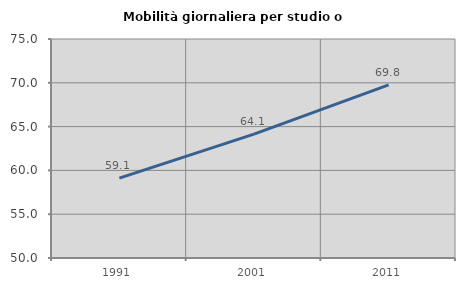
| Category | Mobilità giornaliera per studio o lavoro |
|---|---|
| 1991.0 | 59.117 |
| 2001.0 | 64.134 |
| 2011.0 | 69.772 |